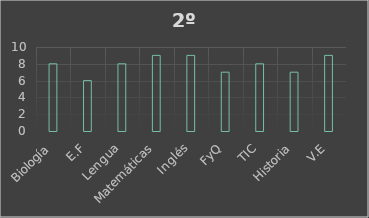
| Category | Series 0 |
|---|---|
| Biología | 8 |
| E.F | 6 |
| Lengua | 8 |
| Matemáticas | 9 |
| Inglés | 9 |
| FyQ | 7 |
| TIC | 8 |
| Historia | 7 |
| V.E | 9 |